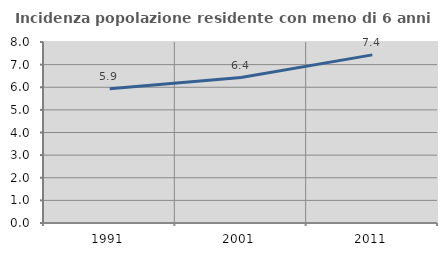
| Category | Incidenza popolazione residente con meno di 6 anni |
|---|---|
| 1991.0 | 5.93 |
| 2001.0 | 6.427 |
| 2011.0 | 7.431 |